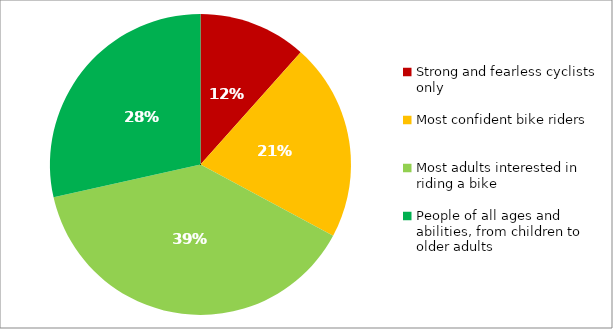
| Category | Responses |
|---|---|
| Strong and fearless cyclists only | 0.116 |
| Most confident bike riders | 0.212 |
| Most adults interested in riding a bike | 0.387 |
| People of all ages and abilities, from children to older adults | 0.285 |